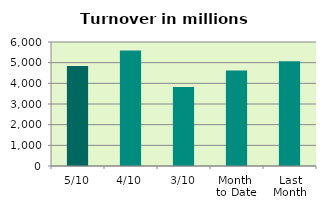
| Category | Series 0 |
|---|---|
| 5/10 | 4843.363 |
| 4/10 | 5583.851 |
| 3/10 | 3819.982 |
| Month 
to Date | 4618.162 |
| Last
Month | 5068.328 |